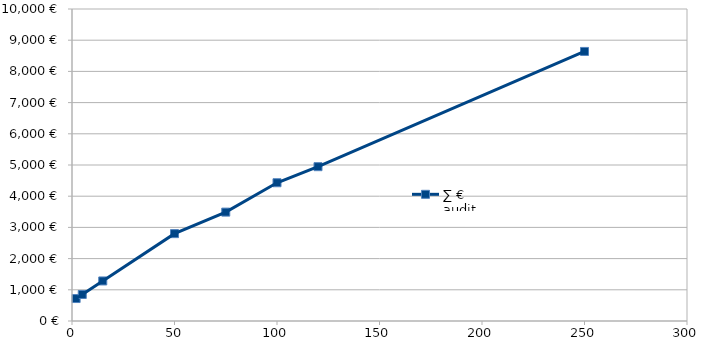
| Category | ∑ € audit con sopralluogo |
|---|---|
| 2.0 | 720 |
| 5.0 | 850 |
| 15.0 | 1283.333 |
| 50.0 | 2800 |
| 75.0 | 3490 |
| 100.0 | 4431.129 |
| 120.0 | 4946.183 |
| 250.0 | 8640 |